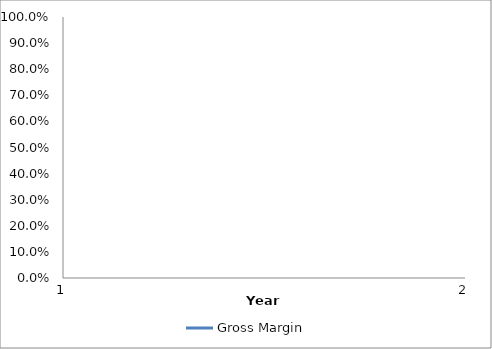
| Category | Gross Margin |
|---|---|
| 0 | 0 |
| 1 | 0 |
| 2 | 0 |
| 3 | 0 |
| 4 | 0 |
| 5 | 0 |
| 6 | 0 |
| 7 | 0 |
| 8 | 0 |
| 9 | 0 |